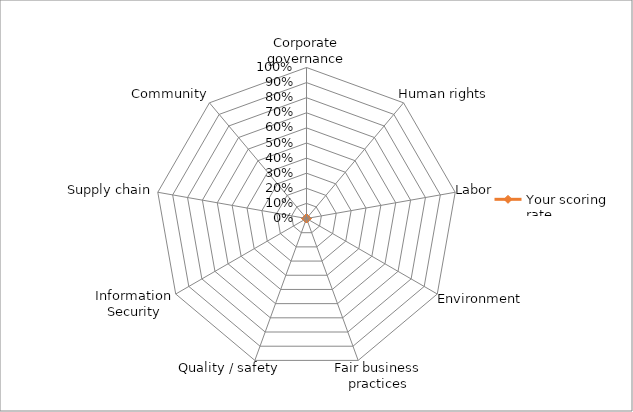
| Category | Your scoring rate |
|---|---|
| Corporate governance | 0 |
| Human rights | 0 |
| Labor | 0 |
| Environment | 0 |
| Fair business practices | 0 |
| Quality / safety | 0 |
| Information Security | 0 |
| Supply chain | 0 |
| Community | 0 |